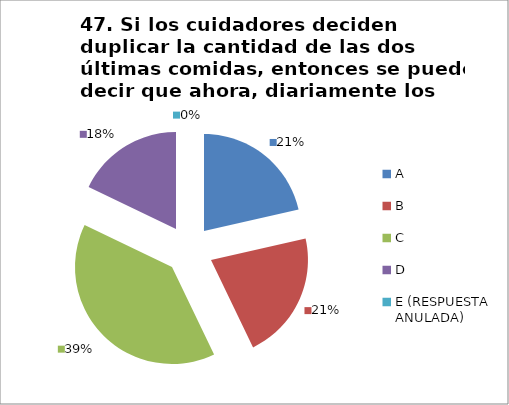
| Category | CANTIDAD DE RESPUESTAS PREGUNTA (47) | PORCENTAJE |
|---|---|---|
| A | 6 | 0.214 |
| B | 6 | 0.214 |
| C | 11 | 0.393 |
| D | 5 | 0.179 |
| E (RESPUESTA ANULADA) | 0 | 0 |